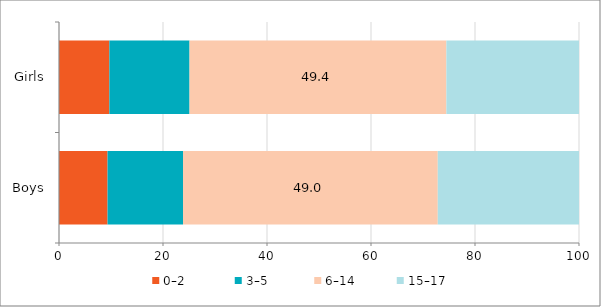
| Category | 0–2   | 3–5  | 6–14 | 15–17 |
|---|---|---|---|---|
| Boys | 9.337 | 14.515 | 48.991 | 27.158 |
| Girls | 9.685 | 15.419 | 49.392 | 25.504 |